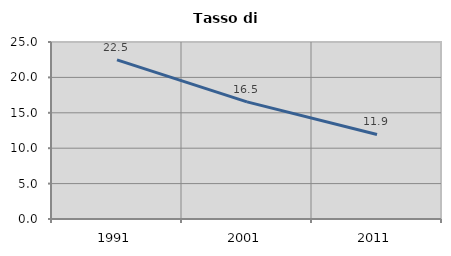
| Category | Tasso di disoccupazione   |
|---|---|
| 1991.0 | 22.465 |
| 2001.0 | 16.539 |
| 2011.0 | 11.937 |